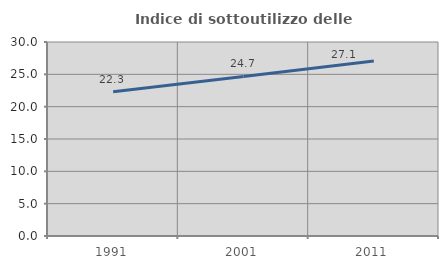
| Category | Indice di sottoutilizzo delle abitazioni  |
|---|---|
| 1991.0 | 22.295 |
| 2001.0 | 24.666 |
| 2011.0 | 27.052 |